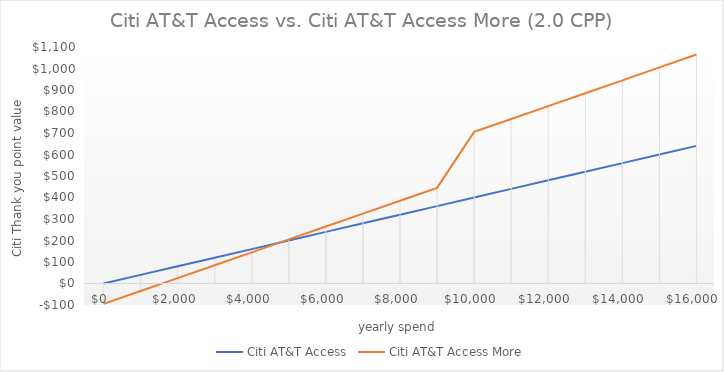
| Category | Citi AT&T Access | Citi AT&T Access More |
|---|---|---|
| 0.0 | 0 | -95 |
| 1000.0 | 40 | -35 |
| 2000.0 | 80 | 25 |
| 3000.0 | 120 | 85 |
| 4000.0 | 160 | 145 |
| 5000.0 | 200 | 205 |
| 6000.0 | 240 | 265 |
| 7000.0 | 280 | 325 |
| 8000.0 | 320 | 385 |
| 9000.0 | 360 | 445 |
| 10000.0 | 400 | 705 |
| 11000.0 | 440 | 765 |
| 12000.0 | 480 | 825 |
| 13000.0 | 520 | 885 |
| 14000.0 | 560 | 945 |
| 15000.0 | 600 | 1005 |
| 16000.0 | 640 | 1065 |